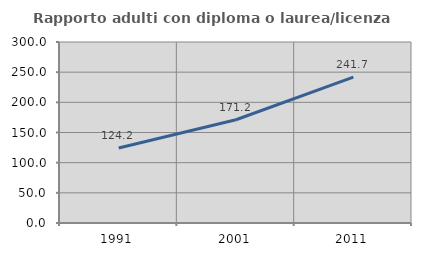
| Category | Rapporto adulti con diploma o laurea/licenza media  |
|---|---|
| 1991.0 | 124.219 |
| 2001.0 | 171.163 |
| 2011.0 | 241.683 |